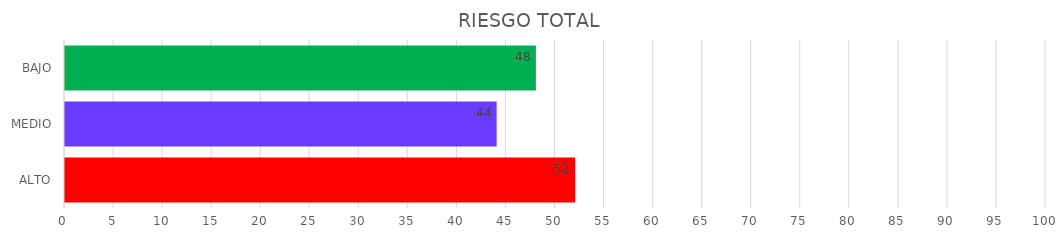
| Category | Series 1 | Series 0 |
|---|---|---|
| ALTO | 52 | 52 |
| MEDIO | 44 | 44 |
| BAJO | 48 | 48 |